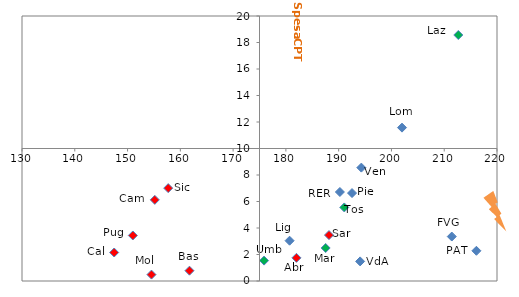
| Category | Series 0 |
|---|---|
| 192.53333333333333 | 6.637 |
| 194.0666666666667 | 1.48 |
| 202.0 | 11.575 |
| 194.29999999999998 | 8.557 |
| 211.43333333333337 | 3.356 |
| 180.70000000000002 | 3.042 |
| 190.23333333333335 | 6.718 |
| 191.0666666666667 | 5.551 |
| 175.86666666666667 | 1.539 |
| 187.5333333333333 | 2.491 |
| 212.66666666666666 | 18.566 |
| 182.0 | 1.748 |
| 154.53333333333333 | 0.483 |
| 155.16666666666666 | 6.125 |
| 151.0 | 3.436 |
| 161.73333333333335 | 0.777 |
| 147.46666666666667 | 2.151 |
| 157.70000000000002 | 7.008 |
| 188.16666666666663 | 3.466 |
| 216.1 | 2.28 |
| 235.76666666666665 | 3.016 |